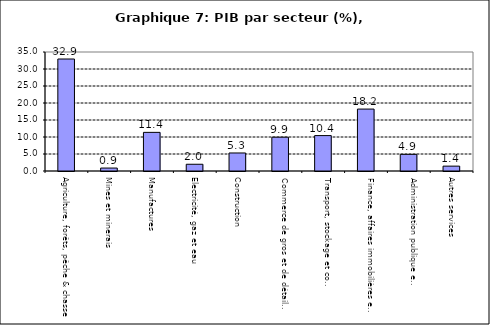
| Category | Series 0 |
|---|---|
| Agriculture, forêts, pêche & chasse | 32.939 |
| Mines et minerais | 0.864 |
| Manufactures | 11.363 |
| Electricité, gaz et eau | 1.981 |
| Construction | 5.299 |
| Commerce de gros et de détail, hôtels et restaurants | 9.94 |
| Transport, stockage et communications                | 10.417 |
| Finance, affaires immobilières et services | 18.213 |
| Administration publique et defense       | 4.895 |
| Autres services                        | 1.433 |